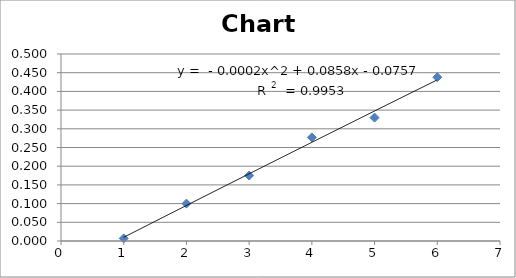
| Category | Series 0 |
|---|---|
| 1.0 | 0.007 |
| 2.0 | 0.1 |
| 3.0 | 0.175 |
| 4.0 | 0.277 |
| 5.0 | 0.33 |
| 6.0 | 0.438 |